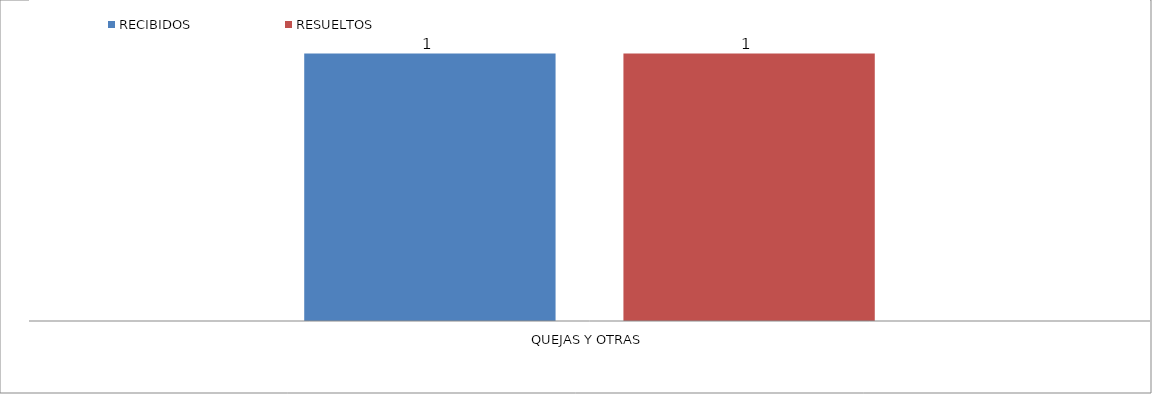
| Category | RECIBIDOS | RESUELTOS  |
|---|---|---|
| QUEJAS Y OTRAS | 1 | 1 |